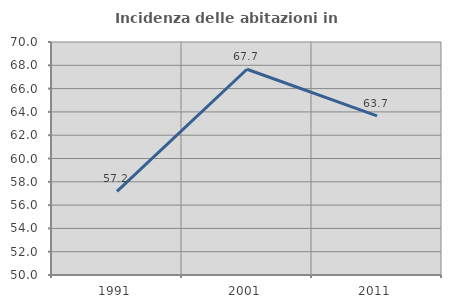
| Category | Incidenza delle abitazioni in proprietà  |
|---|---|
| 1991.0 | 57.179 |
| 2001.0 | 67.662 |
| 2011.0 | 63.659 |